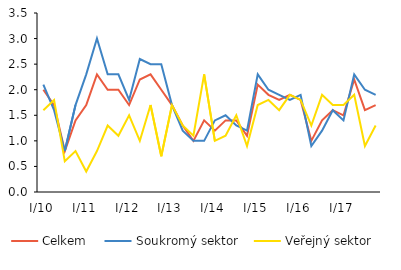
| Category | Celkem | Soukromý sektor | Veřejný sektor |
|---|---|---|---|
| I/10 | 2 | 2.1 | 1.6 |
| II | 1.7 | 1.6 | 1.8 |
| III | 0.8 | 0.8 | 0.6 |
| IV | 1.4 | 1.7 | 0.8 |
| I/11 | 1.7 | 2.3 | 0.4 |
| II | 2.3 | 3 | 0.8 |
| III | 2 | 2.3 | 1.3 |
| IV | 2 | 2.3 | 1.1 |
| I/12 | 1.7 | 1.8 | 1.5 |
| II | 2.2 | 2.6 | 1 |
| III | 2.3 | 2.5 | 1.7 |
| IV | 2 | 2.5 | 0.7 |
| I/13 | 1.7 | 1.7 | 1.7 |
| II | 1.3 | 1.2 | 1.3 |
| III | 1 | 1 | 1.1 |
| IV | 1.4 | 1 | 2.3 |
| I/14 | 1.2 | 1.4 | 1 |
| II | 1.4 | 1.5 | 1.1 |
| III | 1.4 | 1.3 | 1.5 |
| IV | 1.1 | 1.2 | 0.9 |
| I/15 | 2.1 | 2.3 | 1.7 |
| II | 1.9 | 2 | 1.8 |
| III | 1.8 | 1.9 | 1.6 |
| IV | 1.9 | 1.8 | 1.9 |
| I/16 | 1.8 | 1.9 | 1.8 |
| II | 1 | 0.9 | 1.3 |
| III | 1.4 | 1.2 | 1.9 |
| IV | 1.6 | 1.6 | 1.7 |
| I/17 | 1.5 | 1.4 | 1.7 |
| II | 2.2 | 2.3 | 1.9 |
| III | 1.6 | 2 | 0.9 |
| IV | 1.7 | 1.9 | 1.3 |